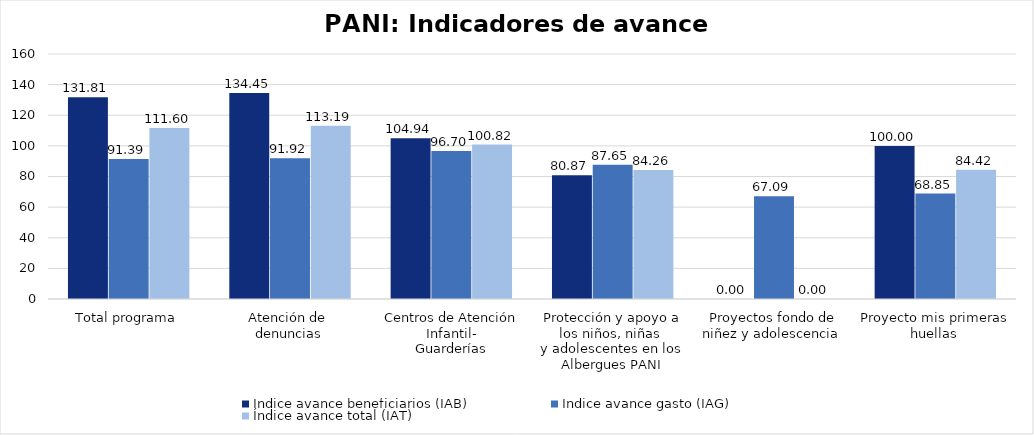
| Category | Índice avance beneficiarios (IAB)  | Índice avance gasto (IAG) | Índice avance total (IAT)  |
|---|---|---|---|
| Total programa | 131.806 | 91.387 | 111.597 |
| Atención de 
denuncias | 134.45 | 91.921 | 113.185 |
| Centros de Atención Infantil-
Guarderías | 104.94 | 96.702 | 100.821 |
| Protección y apoyo a los niños, niñas 
y adolescentes en los Albergues PANI | 80.87 | 87.651 | 84.26 |
| Proyectos fondo de niñez y adolescencia  | 0 | 67.087 | 0 |
| Proyecto mis primeras huellas  | 100 | 68.847 | 84.423 |